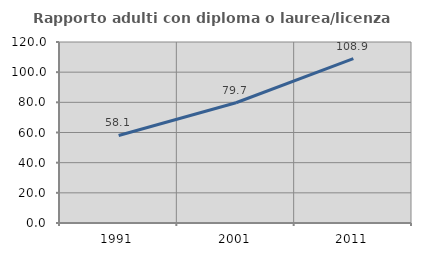
| Category | Rapporto adulti con diploma o laurea/licenza media  |
|---|---|
| 1991.0 | 58.055 |
| 2001.0 | 79.71 |
| 2011.0 | 108.936 |